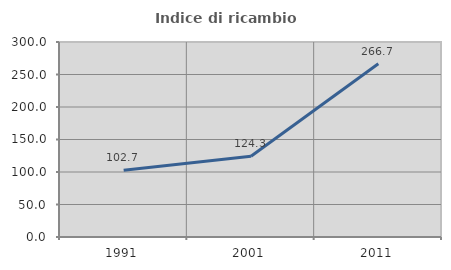
| Category | Indice di ricambio occupazionale  |
|---|---|
| 1991.0 | 102.66 |
| 2001.0 | 124.342 |
| 2011.0 | 266.667 |